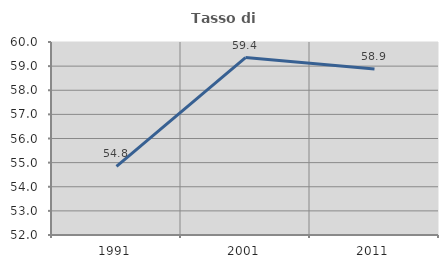
| Category | Tasso di occupazione   |
|---|---|
| 1991.0 | 54.844 |
| 2001.0 | 59.354 |
| 2011.0 | 58.878 |